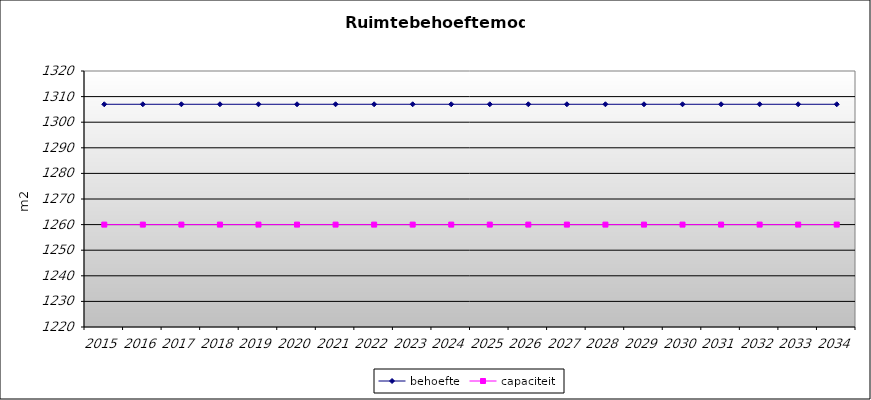
| Category | behoefte | capaciteit |
|---|---|---|
| 2015.0 | 1307 | 1260 |
| 2016.0 | 1307 | 1260 |
| 2017.0 | 1307 | 1260 |
| 2018.0 | 1307 | 1260 |
| 2019.0 | 1307 | 1260 |
| 2020.0 | 1307 | 1260 |
| 2021.0 | 1307 | 1260 |
| 2022.0 | 1307 | 1260 |
| 2023.0 | 1307 | 1260 |
| 2024.0 | 1307 | 1260 |
| 2025.0 | 1307 | 1260 |
| 2026.0 | 1307 | 1260 |
| 2027.0 | 1307 | 1260 |
| 2028.0 | 1307 | 1260 |
| 2029.0 | 1307 | 1260 |
| 2030.0 | 1307 | 1260 |
| 2031.0 | 1307 | 1260 |
| 2032.0 | 1307 | 1260 |
| 2033.0 | 1307 | 1260 |
| 2034.0 | 1307 | 1260 |